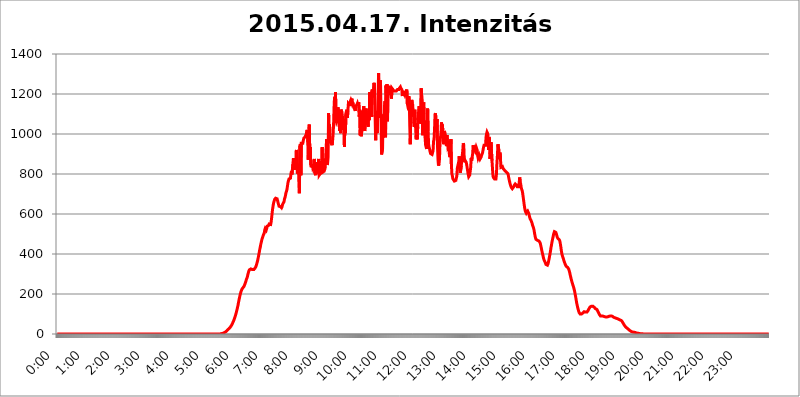
| Category | 2015.04.17. Intenzitás [W/m^2] |
|---|---|
| 0.0 | -0.256 |
| 0.0006944444444444445 | -0.256 |
| 0.001388888888888889 | -0.256 |
| 0.0020833333333333333 | -0.256 |
| 0.002777777777777778 | -0.256 |
| 0.003472222222222222 | -0.256 |
| 0.004166666666666667 | -0.256 |
| 0.004861111111111111 | -0.256 |
| 0.005555555555555556 | -0.256 |
| 0.0062499999999999995 | -0.256 |
| 0.006944444444444444 | -0.256 |
| 0.007638888888888889 | -0.256 |
| 0.008333333333333333 | -0.256 |
| 0.009027777777777779 | -0.256 |
| 0.009722222222222222 | -0.256 |
| 0.010416666666666666 | -0.256 |
| 0.011111111111111112 | -0.256 |
| 0.011805555555555555 | -0.256 |
| 0.012499999999999999 | -0.256 |
| 0.013194444444444444 | -0.256 |
| 0.013888888888888888 | -0.256 |
| 0.014583333333333332 | -0.256 |
| 0.015277777777777777 | -0.256 |
| 0.015972222222222224 | -0.256 |
| 0.016666666666666666 | -0.256 |
| 0.017361111111111112 | -0.256 |
| 0.018055555555555557 | -0.256 |
| 0.01875 | -0.256 |
| 0.019444444444444445 | -0.256 |
| 0.02013888888888889 | -0.256 |
| 0.020833333333333332 | -0.256 |
| 0.02152777777777778 | -0.256 |
| 0.022222222222222223 | -0.256 |
| 0.02291666666666667 | -0.256 |
| 0.02361111111111111 | -0.256 |
| 0.024305555555555556 | -0.256 |
| 0.024999999999999998 | -0.256 |
| 0.025694444444444447 | -0.256 |
| 0.02638888888888889 | -0.256 |
| 0.027083333333333334 | -0.256 |
| 0.027777777777777776 | -0.256 |
| 0.02847222222222222 | -0.256 |
| 0.029166666666666664 | -0.256 |
| 0.029861111111111113 | -0.256 |
| 0.030555555555555555 | -0.256 |
| 0.03125 | -0.256 |
| 0.03194444444444445 | -0.256 |
| 0.03263888888888889 | -0.256 |
| 0.03333333333333333 | -0.256 |
| 0.034027777777777775 | -0.256 |
| 0.034722222222222224 | -0.256 |
| 0.035416666666666666 | -0.256 |
| 0.036111111111111115 | -0.256 |
| 0.03680555555555556 | -0.256 |
| 0.0375 | -0.256 |
| 0.03819444444444444 | -0.256 |
| 0.03888888888888889 | -0.256 |
| 0.03958333333333333 | -0.256 |
| 0.04027777777777778 | -0.256 |
| 0.04097222222222222 | -0.256 |
| 0.041666666666666664 | -0.256 |
| 0.042361111111111106 | -0.256 |
| 0.04305555555555556 | -0.256 |
| 0.043750000000000004 | -0.256 |
| 0.044444444444444446 | -0.256 |
| 0.04513888888888889 | -0.256 |
| 0.04583333333333334 | -0.256 |
| 0.04652777777777778 | -0.256 |
| 0.04722222222222222 | -0.256 |
| 0.04791666666666666 | -0.256 |
| 0.04861111111111111 | -0.256 |
| 0.049305555555555554 | -0.256 |
| 0.049999999999999996 | -0.256 |
| 0.05069444444444445 | -0.256 |
| 0.051388888888888894 | -0.256 |
| 0.052083333333333336 | -0.256 |
| 0.05277777777777778 | -0.256 |
| 0.05347222222222222 | -0.256 |
| 0.05416666666666667 | -0.256 |
| 0.05486111111111111 | -0.256 |
| 0.05555555555555555 | -0.256 |
| 0.05625 | -0.256 |
| 0.05694444444444444 | -0.256 |
| 0.057638888888888885 | -0.256 |
| 0.05833333333333333 | -0.256 |
| 0.05902777777777778 | -0.256 |
| 0.059722222222222225 | -0.256 |
| 0.06041666666666667 | -0.256 |
| 0.061111111111111116 | -0.256 |
| 0.06180555555555556 | -0.256 |
| 0.0625 | -0.256 |
| 0.06319444444444444 | -0.256 |
| 0.06388888888888888 | -0.256 |
| 0.06458333333333334 | -0.256 |
| 0.06527777777777778 | -0.256 |
| 0.06597222222222222 | -0.256 |
| 0.06666666666666667 | -0.256 |
| 0.06736111111111111 | -0.256 |
| 0.06805555555555555 | -0.256 |
| 0.06874999999999999 | -0.256 |
| 0.06944444444444443 | -0.256 |
| 0.07013888888888889 | -0.256 |
| 0.07083333333333333 | -0.256 |
| 0.07152777777777779 | -0.256 |
| 0.07222222222222223 | -0.256 |
| 0.07291666666666667 | -0.256 |
| 0.07361111111111111 | -0.256 |
| 0.07430555555555556 | -0.256 |
| 0.075 | -0.256 |
| 0.07569444444444444 | -0.256 |
| 0.0763888888888889 | -0.256 |
| 0.07708333333333334 | -0.256 |
| 0.07777777777777778 | -0.256 |
| 0.07847222222222222 | -0.256 |
| 0.07916666666666666 | -0.256 |
| 0.0798611111111111 | -0.256 |
| 0.08055555555555556 | -0.256 |
| 0.08125 | -0.256 |
| 0.08194444444444444 | -0.256 |
| 0.08263888888888889 | -0.256 |
| 0.08333333333333333 | -0.256 |
| 0.08402777777777777 | -0.256 |
| 0.08472222222222221 | -0.256 |
| 0.08541666666666665 | -0.256 |
| 0.08611111111111112 | -0.256 |
| 0.08680555555555557 | -0.256 |
| 0.08750000000000001 | -0.256 |
| 0.08819444444444445 | -0.256 |
| 0.08888888888888889 | -0.256 |
| 0.08958333333333333 | -0.256 |
| 0.09027777777777778 | -0.256 |
| 0.09097222222222222 | -0.256 |
| 0.09166666666666667 | -0.256 |
| 0.09236111111111112 | -0.256 |
| 0.09305555555555556 | -0.256 |
| 0.09375 | -0.256 |
| 0.09444444444444444 | -0.256 |
| 0.09513888888888888 | -0.256 |
| 0.09583333333333333 | -0.256 |
| 0.09652777777777777 | -0.256 |
| 0.09722222222222222 | -0.256 |
| 0.09791666666666667 | -0.256 |
| 0.09861111111111111 | -0.256 |
| 0.09930555555555555 | -0.256 |
| 0.09999999999999999 | -0.256 |
| 0.10069444444444443 | -0.256 |
| 0.1013888888888889 | -0.256 |
| 0.10208333333333335 | -0.256 |
| 0.10277777777777779 | -0.256 |
| 0.10347222222222223 | -0.256 |
| 0.10416666666666667 | -0.256 |
| 0.10486111111111111 | -0.256 |
| 0.10555555555555556 | -0.256 |
| 0.10625 | -0.256 |
| 0.10694444444444444 | -0.256 |
| 0.1076388888888889 | -0.256 |
| 0.10833333333333334 | -0.256 |
| 0.10902777777777778 | -0.256 |
| 0.10972222222222222 | -0.256 |
| 0.1111111111111111 | -0.256 |
| 0.11180555555555556 | -0.256 |
| 0.11180555555555556 | -0.256 |
| 0.1125 | -0.256 |
| 0.11319444444444444 | -0.256 |
| 0.11388888888888889 | -0.256 |
| 0.11458333333333333 | -0.256 |
| 0.11527777777777777 | -0.256 |
| 0.11597222222222221 | -0.256 |
| 0.11666666666666665 | -0.256 |
| 0.1173611111111111 | -0.256 |
| 0.11805555555555557 | -0.256 |
| 0.11944444444444445 | -0.256 |
| 0.12013888888888889 | -0.256 |
| 0.12083333333333333 | -0.256 |
| 0.12152777777777778 | -0.256 |
| 0.12222222222222223 | -0.256 |
| 0.12291666666666667 | -0.256 |
| 0.12291666666666667 | -0.256 |
| 0.12361111111111112 | -0.256 |
| 0.12430555555555556 | -0.256 |
| 0.125 | -0.256 |
| 0.12569444444444444 | -0.256 |
| 0.12638888888888888 | -0.256 |
| 0.12708333333333333 | -0.256 |
| 0.16875 | -0.256 |
| 0.12847222222222224 | -0.256 |
| 0.12916666666666668 | -0.256 |
| 0.12986111111111112 | -0.256 |
| 0.13055555555555556 | -0.256 |
| 0.13125 | -0.256 |
| 0.13194444444444445 | -0.256 |
| 0.1326388888888889 | -0.256 |
| 0.13333333333333333 | -0.256 |
| 0.13402777777777777 | -0.256 |
| 0.13402777777777777 | -0.256 |
| 0.13472222222222222 | -0.256 |
| 0.13541666666666666 | -0.256 |
| 0.1361111111111111 | -0.256 |
| 0.13749999999999998 | -0.256 |
| 0.13819444444444443 | -0.256 |
| 0.1388888888888889 | -0.256 |
| 0.13958333333333334 | -0.256 |
| 0.14027777777777778 | -0.256 |
| 0.14097222222222222 | -0.256 |
| 0.14166666666666666 | -0.256 |
| 0.1423611111111111 | -0.256 |
| 0.14305555555555557 | -0.256 |
| 0.14375000000000002 | -0.256 |
| 0.14444444444444446 | -0.256 |
| 0.1451388888888889 | -0.256 |
| 0.1451388888888889 | -0.256 |
| 0.14652777777777778 | -0.256 |
| 0.14722222222222223 | -0.256 |
| 0.14791666666666667 | -0.256 |
| 0.1486111111111111 | -0.256 |
| 0.14930555555555555 | -0.256 |
| 0.15 | -0.256 |
| 0.15069444444444444 | -0.256 |
| 0.15138888888888888 | -0.256 |
| 0.15208333333333332 | -0.256 |
| 0.15277777777777776 | -0.256 |
| 0.15347222222222223 | -0.256 |
| 0.15416666666666667 | -0.256 |
| 0.15486111111111112 | -0.256 |
| 0.15555555555555556 | -0.256 |
| 0.15625 | -0.256 |
| 0.15694444444444444 | -0.256 |
| 0.15763888888888888 | -0.256 |
| 0.15833333333333333 | -0.256 |
| 0.15902777777777777 | -0.256 |
| 0.15972222222222224 | -0.256 |
| 0.16041666666666668 | -0.256 |
| 0.16111111111111112 | -0.256 |
| 0.16180555555555556 | -0.256 |
| 0.1625 | -0.256 |
| 0.16319444444444445 | -0.256 |
| 0.1638888888888889 | -0.256 |
| 0.16458333333333333 | -0.256 |
| 0.16527777777777777 | -0.256 |
| 0.16597222222222222 | -0.256 |
| 0.16666666666666666 | -0.256 |
| 0.1673611111111111 | -0.256 |
| 0.16805555555555554 | -0.256 |
| 0.16874999999999998 | -0.256 |
| 0.16944444444444443 | -0.256 |
| 0.17013888888888887 | -0.256 |
| 0.1708333333333333 | -0.256 |
| 0.17152777777777775 | -0.256 |
| 0.17222222222222225 | -0.256 |
| 0.1729166666666667 | -0.256 |
| 0.17361111111111113 | -0.256 |
| 0.17430555555555557 | -0.256 |
| 0.17500000000000002 | -0.256 |
| 0.17569444444444446 | -0.256 |
| 0.1763888888888889 | -0.256 |
| 0.17708333333333334 | -0.256 |
| 0.17777777777777778 | -0.256 |
| 0.17847222222222223 | -0.256 |
| 0.17916666666666667 | -0.256 |
| 0.1798611111111111 | -0.256 |
| 0.18055555555555555 | -0.256 |
| 0.18125 | -0.256 |
| 0.18194444444444444 | -0.256 |
| 0.1826388888888889 | -0.256 |
| 0.18333333333333335 | -0.256 |
| 0.1840277777777778 | -0.256 |
| 0.18472222222222223 | -0.256 |
| 0.18541666666666667 | -0.256 |
| 0.18611111111111112 | -0.256 |
| 0.18680555555555556 | -0.256 |
| 0.1875 | -0.256 |
| 0.18819444444444444 | -0.256 |
| 0.18888888888888888 | -0.256 |
| 0.18958333333333333 | -0.256 |
| 0.19027777777777777 | -0.256 |
| 0.1909722222222222 | -0.256 |
| 0.19166666666666665 | -0.256 |
| 0.19236111111111112 | -0.256 |
| 0.19305555555555554 | -0.256 |
| 0.19375 | -0.256 |
| 0.19444444444444445 | -0.256 |
| 0.1951388888888889 | -0.256 |
| 0.19583333333333333 | -0.256 |
| 0.19652777777777777 | -0.256 |
| 0.19722222222222222 | -0.256 |
| 0.19791666666666666 | -0.256 |
| 0.1986111111111111 | -0.256 |
| 0.19930555555555554 | -0.256 |
| 0.19999999999999998 | -0.256 |
| 0.20069444444444443 | -0.256 |
| 0.20138888888888887 | -0.256 |
| 0.2020833333333333 | -0.256 |
| 0.2027777777777778 | -0.256 |
| 0.2034722222222222 | -0.256 |
| 0.2041666666666667 | -0.256 |
| 0.20486111111111113 | -0.256 |
| 0.20555555555555557 | -0.256 |
| 0.20625000000000002 | -0.256 |
| 0.20694444444444446 | -0.256 |
| 0.2076388888888889 | -0.256 |
| 0.20833333333333334 | -0.256 |
| 0.20902777777777778 | -0.256 |
| 0.20972222222222223 | -0.256 |
| 0.21041666666666667 | -0.256 |
| 0.2111111111111111 | -0.256 |
| 0.21180555555555555 | -0.256 |
| 0.2125 | -0.256 |
| 0.21319444444444444 | -0.256 |
| 0.2138888888888889 | -0.256 |
| 0.21458333333333335 | -0.256 |
| 0.2152777777777778 | -0.256 |
| 0.21597222222222223 | -0.256 |
| 0.21666666666666667 | -0.256 |
| 0.21736111111111112 | -0.256 |
| 0.21805555555555556 | -0.256 |
| 0.21875 | -0.256 |
| 0.21944444444444444 | -0.256 |
| 0.22013888888888888 | -0.256 |
| 0.22083333333333333 | -0.256 |
| 0.22152777777777777 | -0.256 |
| 0.2222222222222222 | -0.256 |
| 0.22291666666666665 | -0.256 |
| 0.2236111111111111 | -0.256 |
| 0.22430555555555556 | -0.256 |
| 0.225 | -0.256 |
| 0.22569444444444445 | -0.256 |
| 0.2263888888888889 | -0.256 |
| 0.22708333333333333 | -0.256 |
| 0.22777777777777777 | -0.256 |
| 0.22847222222222222 | 1.09 |
| 0.22916666666666666 | 1.09 |
| 0.2298611111111111 | 1.09 |
| 0.23055555555555554 | 2.439 |
| 0.23124999999999998 | 2.439 |
| 0.23194444444444443 | 3.791 |
| 0.23263888888888887 | 3.791 |
| 0.2333333333333333 | 5.146 |
| 0.2340277777777778 | 6.503 |
| 0.2347222222222222 | 7.862 |
| 0.2354166666666667 | 9.225 |
| 0.23611111111111113 | 10.589 |
| 0.23680555555555557 | 13.325 |
| 0.23750000000000002 | 14.696 |
| 0.23819444444444446 | 17.444 |
| 0.2388888888888889 | 20.201 |
| 0.23958333333333334 | 21.582 |
| 0.24027777777777778 | 24.35 |
| 0.24097222222222223 | 27.124 |
| 0.24166666666666667 | 29.905 |
| 0.2423611111111111 | 32.691 |
| 0.24305555555555555 | 36.881 |
| 0.24375 | 39.68 |
| 0.24444444444444446 | 43.886 |
| 0.24513888888888888 | 48.1 |
| 0.24583333333333335 | 53.73 |
| 0.2465277777777778 | 59.368 |
| 0.24722222222222223 | 65.012 |
| 0.24791666666666667 | 70.658 |
| 0.24861111111111112 | 77.715 |
| 0.24930555555555556 | 86.175 |
| 0.25 | 93.212 |
| 0.25069444444444444 | 101.634 |
| 0.2513888888888889 | 111.42 |
| 0.2520833333333333 | 121.152 |
| 0.25277777777777777 | 132.196 |
| 0.2534722222222222 | 143.144 |
| 0.25416666666666665 | 156.678 |
| 0.2548611111111111 | 168.703 |
| 0.2555555555555556 | 180.569 |
| 0.25625000000000003 | 192.271 |
| 0.2569444444444445 | 202.534 |
| 0.2576388888888889 | 211.405 |
| 0.25833333333333336 | 217.681 |
| 0.2590277777777778 | 223.906 |
| 0.25972222222222224 | 227.618 |
| 0.2604166666666667 | 231.313 |
| 0.2611111111111111 | 233.766 |
| 0.26180555555555557 | 237.433 |
| 0.2625 | 242.296 |
| 0.26319444444444445 | 249.538 |
| 0.2638888888888889 | 256.722 |
| 0.26458333333333334 | 263.851 |
| 0.2652777777777778 | 273.281 |
| 0.2659722222222222 | 279.136 |
| 0.26666666666666666 | 286.13 |
| 0.2673611111111111 | 297.728 |
| 0.26805555555555555 | 306.974 |
| 0.26875 | 315.059 |
| 0.26944444444444443 | 320.84 |
| 0.2701388888888889 | 324.314 |
| 0.2708333333333333 | 325.473 |
| 0.27152777777777776 | 325.473 |
| 0.2722222222222222 | 324.314 |
| 0.27291666666666664 | 323.156 |
| 0.2736111111111111 | 321.998 |
| 0.2743055555555555 | 320.84 |
| 0.27499999999999997 | 320.84 |
| 0.27569444444444446 | 321.998 |
| 0.27638888888888885 | 324.314 |
| 0.27708333333333335 | 327.793 |
| 0.2777777777777778 | 331.279 |
| 0.27847222222222223 | 335.941 |
| 0.2791666666666667 | 342.968 |
| 0.2798611111111111 | 351.235 |
| 0.28055555555555556 | 360.798 |
| 0.28125 | 370.515 |
| 0.28194444444444444 | 382.93 |
| 0.2826388888888889 | 395.711 |
| 0.2833333333333333 | 408.934 |
| 0.28402777777777777 | 422.678 |
| 0.2847222222222222 | 434.107 |
| 0.28541666666666665 | 447.487 |
| 0.28611111111111115 | 458.318 |
| 0.28680555555555554 | 469.557 |
| 0.28750000000000003 | 477.854 |
| 0.2881944444444445 | 484.662 |
| 0.2888888888888889 | 493.398 |
| 0.28958333333333336 | 498.764 |
| 0.2902777777777778 | 504.229 |
| 0.29097222222222224 | 519.3 |
| 0.2916666666666667 | 527.122 |
| 0.2923611111111111 | 531.108 |
| 0.29305555555555557 | 519.3 |
| 0.29375 | 527.122 |
| 0.29444444444444445 | 539.234 |
| 0.2951388888888889 | 539.234 |
| 0.29583333333333334 | 539.234 |
| 0.2965277777777778 | 543.376 |
| 0.2972222222222222 | 549.691 |
| 0.29791666666666666 | 551.823 |
| 0.2986111111111111 | 551.823 |
| 0.29930555555555555 | 547.572 |
| 0.3 | 560.495 |
| 0.30069444444444443 | 580.866 |
| 0.3013888888888889 | 604.992 |
| 0.3020833333333333 | 625.508 |
| 0.30277777777777776 | 641.649 |
| 0.3034722222222222 | 655.618 |
| 0.30416666666666664 | 664.234 |
| 0.3048611111111111 | 673.03 |
| 0.3055555555555555 | 676.003 |
| 0.30624999999999997 | 678.997 |
| 0.3069444444444444 | 678.997 |
| 0.3076388888888889 | 678.997 |
| 0.30833333333333335 | 676.003 |
| 0.3090277777777778 | 667.146 |
| 0.30972222222222223 | 655.618 |
| 0.3104166666666667 | 647.179 |
| 0.3111111111111111 | 638.912 |
| 0.31180555555555556 | 638.912 |
| 0.3125 | 636.194 |
| 0.31319444444444444 | 636.194 |
| 0.3138888888888889 | 633.495 |
| 0.3145833333333333 | 630.814 |
| 0.31527777777777777 | 636.194 |
| 0.3159722222222222 | 647.179 |
| 0.31666666666666665 | 652.786 |
| 0.31736111111111115 | 655.618 |
| 0.31805555555555554 | 661.343 |
| 0.31875000000000003 | 676.003 |
| 0.3194444444444445 | 682.011 |
| 0.3201388888888889 | 694.278 |
| 0.32083333333333336 | 706.89 |
| 0.3215277777777778 | 713.328 |
| 0.32222222222222224 | 723.153 |
| 0.3229166666666667 | 739.988 |
| 0.3236111111111111 | 757.414 |
| 0.32430555555555557 | 760.972 |
| 0.325 | 775.451 |
| 0.32569444444444445 | 779.134 |
| 0.3263888888888889 | 771.794 |
| 0.32708333333333334 | 779.134 |
| 0.3277777777777778 | 801.768 |
| 0.3284722222222222 | 813.439 |
| 0.32916666666666666 | 797.931 |
| 0.3298611111111111 | 801.768 |
| 0.33055555555555555 | 849.92 |
| 0.33125 | 879.878 |
| 0.33194444444444443 | 875.511 |
| 0.3326388888888889 | 821.353 |
| 0.3333333333333333 | 845.755 |
| 0.3340277777777778 | 858.335 |
| 0.3347222222222222 | 837.51 |
| 0.3354166666666667 | 920.533 |
| 0.3361111111111111 | 849.92 |
| 0.3368055555555556 | 801.768 |
| 0.33749999999999997 | 849.92 |
| 0.33819444444444446 | 833.43 |
| 0.33888888888888885 | 760.972 |
| 0.33958333333333335 | 703.704 |
| 0.34027777777777773 | 939.404 |
| 0.34097222222222223 | 949.03 |
| 0.3416666666666666 | 794.119 |
| 0.3423611111111111 | 953.892 |
| 0.3430555555555555 | 958.785 |
| 0.34375 | 958.785 |
| 0.3444444444444445 | 953.892 |
| 0.3451388888888889 | 968.671 |
| 0.3458333333333334 | 978.688 |
| 0.34652777777777777 | 978.688 |
| 0.34722222222222227 | 983.747 |
| 0.34791666666666665 | 988.839 |
| 0.34861111111111115 | 993.965 |
| 0.34930555555555554 | 999.125 |
| 0.35000000000000003 | 1014.809 |
| 0.3506944444444444 | 1020.106 |
| 0.3513888888888889 | 958.785 |
| 0.3520833333333333 | 871.173 |
| 0.3527777777777778 | 1004.318 |
| 0.3534722222222222 | 1047.117 |
| 0.3541666666666667 | 915.893 |
| 0.3548611111111111 | 934.639 |
| 0.35555555555555557 | 845.755 |
| 0.35625 | 833.43 |
| 0.35694444444444445 | 837.51 |
| 0.3576388888888889 | 849.92 |
| 0.35833333333333334 | 833.43 |
| 0.3590277777777778 | 837.51 |
| 0.3597222222222222 | 845.755 |
| 0.36041666666666666 | 875.511 |
| 0.3611111111111111 | 805.632 |
| 0.36180555555555555 | 805.632 |
| 0.3625 | 794.119 |
| 0.36319444444444443 | 858.335 |
| 0.3638888888888889 | 801.768 |
| 0.3645833333333333 | 817.382 |
| 0.3652777777777778 | 854.113 |
| 0.3659722222222222 | 813.439 |
| 0.3666666666666667 | 875.511 |
| 0.3673611111111111 | 794.119 |
| 0.3680555555555556 | 797.931 |
| 0.36874999999999997 | 801.768 |
| 0.36944444444444446 | 797.931 |
| 0.37013888888888885 | 797.931 |
| 0.37083333333333335 | 805.632 |
| 0.37152777777777773 | 934.639 |
| 0.37222222222222223 | 809.522 |
| 0.3729166666666666 | 809.522 |
| 0.3736111111111111 | 809.522 |
| 0.3743055555555555 | 813.439 |
| 0.375 | 817.382 |
| 0.3756944444444445 | 829.377 |
| 0.3763888888888889 | 833.43 |
| 0.3770833333333334 | 833.43 |
| 0.37777777777777777 | 973.663 |
| 0.37847222222222227 | 845.755 |
| 0.37916666666666665 | 854.113 |
| 0.37986111111111115 | 884.274 |
| 0.38055555555555554 | 1103.843 |
| 0.38125000000000003 | 1004.318 |
| 0.3819444444444444 | 1047.117 |
| 0.3826388888888889 | 953.892 |
| 0.3833333333333333 | 968.671 |
| 0.3840277777777778 | 963.712 |
| 0.3847222222222222 | 963.712 |
| 0.3854166666666667 | 944.201 |
| 0.3861111111111111 | 963.712 |
| 0.38680555555555557 | 993.965 |
| 0.3875 | 1041.644 |
| 0.38819444444444445 | 1127.578 |
| 0.3888888888888889 | 1183.249 |
| 0.38958333333333334 | 1139.675 |
| 0.3902777777777778 | 1209.029 |
| 0.3909722222222222 | 1069.368 |
| 0.39166666666666666 | 1058.17 |
| 0.3923611111111111 | 1063.751 |
| 0.39305555555555555 | 1098.004 |
| 0.39375 | 1133.607 |
| 0.39444444444444443 | 1098.004 |
| 0.3951388888888889 | 1121.587 |
| 0.3958333333333333 | 1014.809 |
| 0.3965277777777778 | 1092.203 |
| 0.3972222222222222 | 1004.318 |
| 0.3979166666666667 | 1121.587 |
| 0.3986111111111111 | 1115.634 |
| 0.3993055555555556 | 1109.72 |
| 0.39999999999999997 | 1086.439 |
| 0.40069444444444446 | 1020.106 |
| 0.40138888888888885 | 1020.106 |
| 0.40208333333333335 | 1041.644 |
| 0.40277777777777773 | 934.639 |
| 0.40347222222222223 | 1075.021 |
| 0.4041666666666666 | 1004.318 |
| 0.4048611111111111 | 1103.843 |
| 0.4055555555555555 | 1103.843 |
| 0.40625 | 1121.587 |
| 0.4069444444444445 | 1080.711 |
| 0.4076388888888889 | 1115.634 |
| 0.4083333333333334 | 1151.928 |
| 0.40902777777777777 | 1151.928 |
| 0.40972222222222227 | 1145.782 |
| 0.41041666666666665 | 1139.675 |
| 0.41111111111111115 | 1164.337 |
| 0.41180555555555554 | 1170.601 |
| 0.41250000000000003 | 1164.337 |
| 0.4131944444444444 | 1176.905 |
| 0.4138888888888889 | 1151.928 |
| 0.4145833333333333 | 1158.113 |
| 0.4152777777777778 | 1133.607 |
| 0.4159722222222222 | 1145.782 |
| 0.4166666666666667 | 1127.578 |
| 0.4173611111111111 | 1121.587 |
| 0.41805555555555557 | 1115.634 |
| 0.41875 | 1139.675 |
| 0.41944444444444445 | 1139.675 |
| 0.4201388888888889 | 1145.782 |
| 0.42083333333333334 | 1151.928 |
| 0.4215277777777778 | 1139.675 |
| 0.4222222222222222 | 1139.675 |
| 0.42291666666666666 | 1158.113 |
| 0.4236111111111111 | 1086.439 |
| 0.42430555555555555 | 1121.587 |
| 0.425 | 993.965 |
| 0.42569444444444443 | 1115.634 |
| 0.4263888888888889 | 988.839 |
| 0.4270833333333333 | 1014.809 |
| 0.4277777777777778 | 1063.751 |
| 0.4284722222222222 | 1036.206 |
| 0.4291666666666667 | 1069.368 |
| 0.4298611111111111 | 1139.675 |
| 0.4305555555555556 | 1052.625 |
| 0.43124999999999997 | 1014.809 |
| 0.43194444444444446 | 1052.625 |
| 0.43263888888888885 | 1115.634 |
| 0.43333333333333335 | 1127.578 |
| 0.43402777777777773 | 1063.751 |
| 0.43472222222222223 | 1058.17 |
| 0.4354166666666666 | 1047.117 |
| 0.4361111111111111 | 1036.206 |
| 0.4368055555555555 | 1115.634 |
| 0.4375 | 1069.368 |
| 0.4381944444444445 | 1209.029 |
| 0.4388888888888889 | 1209.029 |
| 0.4395833333333334 | 1086.439 |
| 0.44027777777777777 | 1209.029 |
| 0.44097222222222227 | 1086.439 |
| 0.44166666666666665 | 1222.164 |
| 0.44236111111111115 | 1196.058 |
| 0.44305555555555554 | 1183.249 |
| 0.44375000000000003 | 1183.249 |
| 0.4444444444444444 | 1255.731 |
| 0.4451388888888889 | 1215.576 |
| 0.4458333333333333 | 1086.439 |
| 0.4465277777777778 | 968.671 |
| 0.4472222222222222 | 1052.625 |
| 0.4479166666666667 | 1115.634 |
| 0.4486111111111111 | 1004.318 |
| 0.44930555555555557 | 1069.368 |
| 0.45 | 1069.368 |
| 0.45069444444444445 | 1304.515 |
| 0.4513888888888889 | 1145.782 |
| 0.45208333333333334 | 1080.711 |
| 0.4527777777777778 | 1269.454 |
| 0.4534722222222222 | 1242.179 |
| 0.45416666666666666 | 1242.179 |
| 0.4548611111111111 | 897.643 |
| 0.45555555555555555 | 897.643 |
| 0.45625 | 925.203 |
| 0.45694444444444443 | 1098.004 |
| 0.4576388888888889 | 983.747 |
| 0.4583333333333333 | 1025.437 |
| 0.4590277777777778 | 1139.675 |
| 0.4597222222222222 | 1164.337 |
| 0.4604166666666667 | 983.747 |
| 0.4611111111111111 | 1242.179 |
| 0.4618055555555556 | 1189.633 |
| 0.46249999999999997 | 1248.934 |
| 0.46319444444444446 | 1063.751 |
| 0.46388888888888885 | 1235.465 |
| 0.46458333333333335 | 1235.465 |
| 0.46527777777777773 | 1235.465 |
| 0.46597222222222223 | 1235.465 |
| 0.4666666666666666 | 1235.465 |
| 0.4673611111111111 | 1222.164 |
| 0.4680555555555555 | 1202.523 |
| 0.46875 | 1176.905 |
| 0.4694444444444445 | 1228.794 |
| 0.4701388888888889 | 1228.794 |
| 0.4708333333333334 | 1222.164 |
| 0.47152777777777777 | 1215.576 |
| 0.47222222222222227 | 1215.576 |
| 0.47291666666666665 | 1215.576 |
| 0.47361111111111115 | 1215.576 |
| 0.47430555555555554 | 1215.576 |
| 0.47500000000000003 | 1215.576 |
| 0.4756944444444444 | 1215.576 |
| 0.4763888888888889 | 1215.576 |
| 0.4770833333333333 | 1222.164 |
| 0.4777777777777778 | 1222.164 |
| 0.4784722222222222 | 1222.164 |
| 0.4791666666666667 | 1222.164 |
| 0.4798611111111111 | 1228.794 |
| 0.48055555555555557 | 1228.794 |
| 0.48125 | 1235.465 |
| 0.48194444444444445 | 1228.794 |
| 0.4826388888888889 | 1228.794 |
| 0.48333333333333334 | 1222.164 |
| 0.4840277777777778 | 1189.633 |
| 0.4847222222222222 | 1215.576 |
| 0.48541666666666666 | 1209.029 |
| 0.4861111111111111 | 1209.029 |
| 0.48680555555555555 | 1202.523 |
| 0.4875 | 1196.058 |
| 0.48819444444444443 | 1196.058 |
| 0.4888888888888889 | 1209.029 |
| 0.4895833333333333 | 1209.029 |
| 0.4902777777777778 | 1222.164 |
| 0.4909722222222222 | 1151.928 |
| 0.4916666666666667 | 1139.675 |
| 0.4923611111111111 | 1145.782 |
| 0.4930555555555556 | 1189.633 |
| 0.49374999999999997 | 1164.337 |
| 0.49444444444444446 | 1036.206 |
| 0.49513888888888885 | 949.03 |
| 0.49583333333333335 | 1098.004 |
| 0.49652777777777773 | 1115.634 |
| 0.49722222222222223 | 1170.601 |
| 0.4979166666666666 | 1151.928 |
| 0.4986111111111111 | 1145.782 |
| 0.4993055555555555 | 1086.439 |
| 0.5 | 1109.72 |
| 0.5006944444444444 | 1036.206 |
| 0.5013888888888889 | 1121.587 |
| 0.5020833333333333 | 1069.368 |
| 0.5027777777777778 | 1069.368 |
| 0.5034722222222222 | 973.663 |
| 0.5041666666666667 | 1030.804 |
| 0.5048611111111111 | 973.663 |
| 0.5055555555555555 | 1036.206 |
| 0.50625 | 1080.711 |
| 0.5069444444444444 | 1115.634 |
| 0.5076388888888889 | 1139.675 |
| 0.5083333333333333 | 1052.625 |
| 0.5090277777777777 | 1058.17 |
| 0.5097222222222222 | 1058.17 |
| 0.5104166666666666 | 1228.794 |
| 0.5111111111111112 | 1228.794 |
| 0.5118055555555555 | 1151.928 |
| 0.5125000000000001 | 993.965 |
| 0.5131944444444444 | 1058.17 |
| 0.513888888888889 | 1158.113 |
| 0.5145833333333333 | 1103.843 |
| 0.5152777777777778 | 1030.804 |
| 0.5159722222222222 | 978.688 |
| 0.5166666666666667 | 944.201 |
| 0.517361111111111 | 934.639 |
| 0.5180555555555556 | 925.203 |
| 0.5187499999999999 | 963.712 |
| 0.5194444444444445 | 1127.578 |
| 0.5201388888888888 | 1014.809 |
| 0.5208333333333334 | 949.03 |
| 0.5215277777777778 | 934.639 |
| 0.5222222222222223 | 925.203 |
| 0.5229166666666667 | 911.285 |
| 0.5236111111111111 | 902.16 |
| 0.5243055555555556 | 902.16 |
| 0.525 | 897.643 |
| 0.5256944444444445 | 897.643 |
| 0.5263888888888889 | 902.16 |
| 0.5270833333333333 | 915.893 |
| 0.5277777777777778 | 963.712 |
| 0.5284722222222222 | 973.663 |
| 0.5291666666666667 | 1025.437 |
| 0.5298611111111111 | 1098.004 |
| 0.5305555555555556 | 1103.843 |
| 0.53125 | 1047.117 |
| 0.5319444444444444 | 1025.437 |
| 0.5326388888888889 | 1075.021 |
| 0.5333333333333333 | 934.639 |
| 0.5340277777777778 | 871.173 |
| 0.5347222222222222 | 841.619 |
| 0.5354166666666667 | 849.92 |
| 0.5361111111111111 | 875.511 |
| 0.5368055555555555 | 953.892 |
| 0.5375 | 983.747 |
| 0.5381944444444444 | 999.125 |
| 0.5388888888888889 | 1058.17 |
| 0.5395833333333333 | 1036.206 |
| 0.5402777777777777 | 1047.117 |
| 0.5409722222222222 | 993.965 |
| 0.5416666666666666 | 949.03 |
| 0.5423611111111112 | 978.688 |
| 0.5430555555555555 | 1014.809 |
| 0.5437500000000001 | 1004.318 |
| 0.5444444444444444 | 993.965 |
| 0.545138888888889 | 958.785 |
| 0.5458333333333333 | 939.404 |
| 0.5465277777777778 | 993.965 |
| 0.5472222222222222 | 963.712 |
| 0.5479166666666667 | 934.639 |
| 0.548611111111111 | 929.905 |
| 0.5493055555555556 | 944.201 |
| 0.5499999999999999 | 897.643 |
| 0.5506944444444445 | 884.274 |
| 0.5513888888888888 | 884.274 |
| 0.5520833333333334 | 973.663 |
| 0.5527777777777778 | 849.92 |
| 0.5534722222222223 | 801.768 |
| 0.5541666666666667 | 790.334 |
| 0.5548611111111111 | 775.451 |
| 0.5555555555555556 | 771.794 |
| 0.55625 | 771.794 |
| 0.5569444444444445 | 764.555 |
| 0.5576388888888889 | 760.972 |
| 0.5583333333333333 | 760.972 |
| 0.5590277777777778 | 768.162 |
| 0.5597222222222222 | 771.794 |
| 0.5604166666666667 | 790.334 |
| 0.5611111111111111 | 829.377 |
| 0.5618055555555556 | 833.43 |
| 0.5625 | 829.377 |
| 0.5631944444444444 | 862.585 |
| 0.5638888888888889 | 888.701 |
| 0.5645833333333333 | 825.351 |
| 0.5652777777777778 | 805.632 |
| 0.5659722222222222 | 809.522 |
| 0.5666666666666667 | 841.619 |
| 0.5673611111111111 | 871.173 |
| 0.5680555555555555 | 893.157 |
| 0.56875 | 915.893 |
| 0.5694444444444444 | 953.892 |
| 0.5701388888888889 | 944.201 |
| 0.5708333333333333 | 875.511 |
| 0.5715277777777777 | 858.335 |
| 0.5722222222222222 | 866.865 |
| 0.5729166666666666 | 862.585 |
| 0.5736111111111112 | 858.335 |
| 0.5743055555555555 | 845.755 |
| 0.5750000000000001 | 829.377 |
| 0.5756944444444444 | 813.439 |
| 0.576388888888889 | 797.931 |
| 0.5770833333333333 | 786.575 |
| 0.5777777777777778 | 782.842 |
| 0.5784722222222222 | 794.119 |
| 0.5791666666666667 | 813.439 |
| 0.579861111111111 | 833.43 |
| 0.5805555555555556 | 879.878 |
| 0.5812499999999999 | 866.865 |
| 0.5819444444444445 | 884.274 |
| 0.5826388888888888 | 902.16 |
| 0.5833333333333334 | 944.201 |
| 0.5840277777777778 | 934.639 |
| 0.5847222222222223 | 934.639 |
| 0.5854166666666667 | 934.639 |
| 0.5861111111111111 | 915.893 |
| 0.5868055555555556 | 915.893 |
| 0.5875 | 934.639 |
| 0.5881944444444445 | 939.404 |
| 0.5888888888888889 | 920.533 |
| 0.5895833333333333 | 893.157 |
| 0.5902777777777778 | 879.878 |
| 0.5909722222222222 | 884.274 |
| 0.5916666666666667 | 893.157 |
| 0.5923611111111111 | 888.701 |
| 0.5930555555555556 | 875.511 |
| 0.59375 | 875.511 |
| 0.5944444444444444 | 884.274 |
| 0.5951388888888889 | 893.157 |
| 0.5958333333333333 | 893.157 |
| 0.5965277777777778 | 906.707 |
| 0.5972222222222222 | 920.533 |
| 0.5979166666666667 | 934.639 |
| 0.5986111111111111 | 944.201 |
| 0.5993055555555555 | 944.201 |
| 0.6 | 939.404 |
| 0.6006944444444444 | 944.201 |
| 0.6013888888888889 | 983.747 |
| 0.6020833333333333 | 999.125 |
| 0.6027777777777777 | 1009.546 |
| 0.6034722222222222 | 1004.318 |
| 0.6041666666666666 | 993.965 |
| 0.6048611111111112 | 920.533 |
| 0.6055555555555555 | 983.747 |
| 0.6062500000000001 | 978.688 |
| 0.6069444444444444 | 875.511 |
| 0.607638888888889 | 871.173 |
| 0.6083333333333333 | 958.785 |
| 0.6090277777777778 | 953.892 |
| 0.6097222222222222 | 866.865 |
| 0.6104166666666667 | 866.865 |
| 0.611111111111111 | 790.334 |
| 0.6118055555555556 | 782.842 |
| 0.6124999999999999 | 779.134 |
| 0.6131944444444445 | 775.451 |
| 0.6138888888888888 | 771.794 |
| 0.6145833333333334 | 779.134 |
| 0.6152777777777778 | 775.451 |
| 0.6159722222222223 | 797.931 |
| 0.6166666666666667 | 854.113 |
| 0.6173611111111111 | 893.157 |
| 0.6180555555555556 | 949.03 |
| 0.61875 | 953.892 |
| 0.6194444444444445 | 915.893 |
| 0.6201388888888889 | 875.511 |
| 0.6208333333333333 | 906.707 |
| 0.6215277777777778 | 888.701 |
| 0.6222222222222222 | 833.43 |
| 0.6229166666666667 | 829.377 |
| 0.6236111111111111 | 829.377 |
| 0.6243055555555556 | 837.51 |
| 0.625 | 833.43 |
| 0.6256944444444444 | 825.351 |
| 0.6263888888888889 | 825.351 |
| 0.6270833333333333 | 825.351 |
| 0.6277777777777778 | 817.382 |
| 0.6284722222222222 | 813.439 |
| 0.6291666666666667 | 817.382 |
| 0.6298611111111111 | 809.522 |
| 0.6305555555555555 | 805.632 |
| 0.63125 | 809.522 |
| 0.6319444444444444 | 801.768 |
| 0.6326388888888889 | 794.119 |
| 0.6333333333333333 | 779.134 |
| 0.6340277777777777 | 768.162 |
| 0.6347222222222222 | 757.414 |
| 0.6354166666666666 | 746.886 |
| 0.6361111111111112 | 739.988 |
| 0.6368055555555555 | 733.184 |
| 0.6375000000000001 | 729.817 |
| 0.6381944444444444 | 726.474 |
| 0.638888888888889 | 726.474 |
| 0.6395833333333333 | 729.817 |
| 0.6402777777777778 | 736.574 |
| 0.6409722222222222 | 743.425 |
| 0.6416666666666667 | 746.886 |
| 0.642361111111111 | 750.371 |
| 0.6430555555555556 | 746.886 |
| 0.6437499999999999 | 746.886 |
| 0.6444444444444445 | 743.425 |
| 0.6451388888888888 | 736.574 |
| 0.6458333333333334 | 736.574 |
| 0.6465277777777778 | 736.574 |
| 0.6472222222222223 | 736.574 |
| 0.6479166666666667 | 757.414 |
| 0.6486111111111111 | 782.842 |
| 0.6493055555555556 | 757.414 |
| 0.65 | 750.371 |
| 0.6506944444444445 | 733.184 |
| 0.6513888888888889 | 723.153 |
| 0.6520833333333333 | 716.58 |
| 0.6527777777777778 | 703.704 |
| 0.6534722222222222 | 685.046 |
| 0.6541666666666667 | 667.146 |
| 0.6548611111111111 | 647.179 |
| 0.6555555555555556 | 630.814 |
| 0.65625 | 617.682 |
| 0.6569444444444444 | 610.016 |
| 0.6576388888888889 | 604.992 |
| 0.6583333333333333 | 610.016 |
| 0.6590277777777778 | 612.554 |
| 0.6597222222222222 | 615.11 |
| 0.6604166666666667 | 612.554 |
| 0.6611111111111111 | 604.992 |
| 0.6618055555555555 | 595.145 |
| 0.6625 | 585.562 |
| 0.6631944444444444 | 576.233 |
| 0.6638888888888889 | 571.661 |
| 0.6645833333333333 | 567.15 |
| 0.6652777777777777 | 560.495 |
| 0.6659722222222222 | 553.97 |
| 0.6666666666666666 | 543.376 |
| 0.6673611111111111 | 537.182 |
| 0.6680555555555556 | 529.108 |
| 0.6687500000000001 | 519.3 |
| 0.6694444444444444 | 504.229 |
| 0.6701388888888888 | 489.873 |
| 0.6708333333333334 | 479.541 |
| 0.6715277777777778 | 472.848 |
| 0.6722222222222222 | 467.925 |
| 0.6729166666666666 | 467.925 |
| 0.6736111111111112 | 467.925 |
| 0.6743055555555556 | 467.925 |
| 0.6749999999999999 | 467.925 |
| 0.6756944444444444 | 464.688 |
| 0.6763888888888889 | 461.486 |
| 0.6770833333333334 | 456.747 |
| 0.6777777777777777 | 449.011 |
| 0.6784722222222223 | 437.031 |
| 0.6791666666666667 | 425.497 |
| 0.6798611111111111 | 412.998 |
| 0.6805555555555555 | 402.262 |
| 0.68125 | 391.834 |
| 0.6819444444444445 | 380.42 |
| 0.6826388888888889 | 371.742 |
| 0.6833333333333332 | 366.851 |
| 0.6840277777777778 | 360.798 |
| 0.6847222222222222 | 354.805 |
| 0.6854166666666667 | 347.682 |
| 0.686111111111111 | 344.144 |
| 0.6868055555555556 | 342.968 |
| 0.6875 | 344.144 |
| 0.6881944444444444 | 350.049 |
| 0.688888888888889 | 359.595 |
| 0.6895833333333333 | 371.742 |
| 0.6902777777777778 | 384.191 |
| 0.6909722222222222 | 398.318 |
| 0.6916666666666668 | 412.998 |
| 0.6923611111111111 | 428.341 |
| 0.6930555555555555 | 442.962 |
| 0.69375 | 456.747 |
| 0.6944444444444445 | 469.557 |
| 0.6951388888888889 | 481.238 |
| 0.6958333333333333 | 493.398 |
| 0.6965277777777777 | 504.229 |
| 0.6972222222222223 | 511.671 |
| 0.6979166666666666 | 515.462 |
| 0.6986111111111111 | 513.561 |
| 0.6993055555555556 | 507.927 |
| 0.7000000000000001 | 500.575 |
| 0.7006944444444444 | 491.63 |
| 0.7013888888888888 | 482.945 |
| 0.7020833333333334 | 477.854 |
| 0.7027777777777778 | 474.507 |
| 0.7034722222222222 | 474.507 |
| 0.7041666666666666 | 471.198 |
| 0.7048611111111112 | 464.688 |
| 0.7055555555555556 | 452.082 |
| 0.7062499999999999 | 437.031 |
| 0.7069444444444444 | 418.495 |
| 0.7076388888888889 | 402.262 |
| 0.7083333333333334 | 393.122 |
| 0.7090277777777777 | 385.455 |
| 0.7097222222222223 | 377.925 |
| 0.7104166666666667 | 369.291 |
| 0.7111111111111111 | 362.004 |
| 0.7118055555555555 | 354.805 |
| 0.7125 | 347.682 |
| 0.7131944444444445 | 342.968 |
| 0.7138888888888889 | 338.278 |
| 0.7145833333333332 | 335.941 |
| 0.7152777777777778 | 334.774 |
| 0.7159722222222222 | 332.443 |
| 0.7166666666666667 | 330.117 |
| 0.717361111111111 | 324.314 |
| 0.7180555555555556 | 316.215 |
| 0.71875 | 306.974 |
| 0.7194444444444444 | 295.413 |
| 0.720138888888889 | 284.967 |
| 0.7208333333333333 | 274.454 |
| 0.7215277777777778 | 265.034 |
| 0.7222222222222222 | 256.722 |
| 0.7229166666666668 | 248.335 |
| 0.7236111111111111 | 239.868 |
| 0.7243055555555555 | 232.54 |
| 0.725 | 222.665 |
| 0.7256944444444445 | 212.664 |
| 0.7263888888888889 | 198.701 |
| 0.7270833333333333 | 185.79 |
| 0.7277777777777777 | 171.353 |
| 0.7284722222222223 | 156.678 |
| 0.7291666666666666 | 144.506 |
| 0.7298611111111111 | 133.57 |
| 0.7305555555555556 | 123.922 |
| 0.7312500000000001 | 114.207 |
| 0.7319444444444444 | 107.232 |
| 0.7326388888888888 | 103.035 |
| 0.7333333333333334 | 100.233 |
| 0.7340277777777778 | 100.233 |
| 0.7347222222222222 | 98.83 |
| 0.7354166666666666 | 100.233 |
| 0.7361111111111112 | 100.233 |
| 0.7368055555555556 | 103.035 |
| 0.7374999999999999 | 105.834 |
| 0.7381944444444444 | 108.629 |
| 0.7388888888888889 | 111.42 |
| 0.7395833333333334 | 111.42 |
| 0.7402777777777777 | 111.42 |
| 0.7409722222222223 | 110.025 |
| 0.7416666666666667 | 110.025 |
| 0.7423611111111111 | 108.629 |
| 0.7430555555555555 | 110.025 |
| 0.74375 | 112.814 |
| 0.7444444444444445 | 116.989 |
| 0.7451388888888889 | 121.152 |
| 0.7458333333333332 | 126.685 |
| 0.7465277777777778 | 130.821 |
| 0.7472222222222222 | 134.943 |
| 0.7479166666666667 | 137.683 |
| 0.748611111111111 | 139.051 |
| 0.7493055555555556 | 139.051 |
| 0.75 | 139.051 |
| 0.7506944444444444 | 139.051 |
| 0.751388888888889 | 139.051 |
| 0.7520833333333333 | 139.051 |
| 0.7527777777777778 | 136.314 |
| 0.7534722222222222 | 132.196 |
| 0.7541666666666668 | 129.444 |
| 0.7548611111111111 | 126.685 |
| 0.7555555555555555 | 125.304 |
| 0.75625 | 123.922 |
| 0.7569444444444445 | 122.538 |
| 0.7576388888888889 | 118.378 |
| 0.7583333333333333 | 112.814 |
| 0.7590277777777777 | 107.232 |
| 0.7597222222222223 | 103.035 |
| 0.7604166666666666 | 97.427 |
| 0.7611111111111111 | 93.212 |
| 0.7618055555555556 | 90.399 |
| 0.7625000000000001 | 90.399 |
| 0.7631944444444444 | 90.399 |
| 0.7638888888888888 | 90.399 |
| 0.7645833333333334 | 90.399 |
| 0.7652777777777778 | 88.991 |
| 0.7659722222222222 | 88.991 |
| 0.7666666666666666 | 87.583 |
| 0.7673611111111112 | 86.175 |
| 0.7680555555555556 | 86.175 |
| 0.7687499999999999 | 84.766 |
| 0.7694444444444444 | 84.766 |
| 0.7701388888888889 | 84.766 |
| 0.7708333333333334 | 84.766 |
| 0.7715277777777777 | 86.175 |
| 0.7722222222222223 | 86.175 |
| 0.7729166666666667 | 86.175 |
| 0.7736111111111111 | 87.583 |
| 0.7743055555555555 | 88.991 |
| 0.775 | 90.399 |
| 0.7756944444444445 | 90.399 |
| 0.7763888888888889 | 90.399 |
| 0.7770833333333332 | 90.399 |
| 0.7777777777777778 | 88.991 |
| 0.7784722222222222 | 88.991 |
| 0.7791666666666667 | 86.175 |
| 0.779861111111111 | 84.766 |
| 0.7805555555555556 | 83.356 |
| 0.78125 | 81.946 |
| 0.7819444444444444 | 81.946 |
| 0.782638888888889 | 80.536 |
| 0.7833333333333333 | 79.125 |
| 0.7840277777777778 | 79.125 |
| 0.7847222222222222 | 77.715 |
| 0.7854166666666668 | 76.304 |
| 0.7861111111111111 | 76.304 |
| 0.7868055555555555 | 74.892 |
| 0.7875 | 73.481 |
| 0.7881944444444445 | 72.069 |
| 0.7888888888888889 | 70.658 |
| 0.7895833333333333 | 69.246 |
| 0.7902777777777777 | 67.835 |
| 0.7909722222222223 | 67.835 |
| 0.7916666666666666 | 65.012 |
| 0.7923611111111111 | 62.189 |
| 0.7930555555555556 | 57.958 |
| 0.7937500000000001 | 53.73 |
| 0.7944444444444444 | 49.507 |
| 0.7951388888888888 | 45.29 |
| 0.7958333333333334 | 42.483 |
| 0.7965277777777778 | 38.28 |
| 0.7972222222222222 | 35.483 |
| 0.7979166666666666 | 32.691 |
| 0.7986111111111112 | 31.297 |
| 0.7993055555555556 | 28.514 |
| 0.7999999999999999 | 27.124 |
| 0.8006944444444444 | 24.35 |
| 0.8013888888888889 | 22.965 |
| 0.8020833333333334 | 20.201 |
| 0.8027777777777777 | 17.444 |
| 0.8034722222222223 | 16.069 |
| 0.8041666666666667 | 14.696 |
| 0.8048611111111111 | 13.325 |
| 0.8055555555555555 | 11.956 |
| 0.80625 | 10.589 |
| 0.8069444444444445 | 10.589 |
| 0.8076388888888889 | 10.589 |
| 0.8083333333333332 | 9.225 |
| 0.8090277777777778 | 9.225 |
| 0.8097222222222222 | 7.862 |
| 0.8104166666666667 | 7.862 |
| 0.811111111111111 | 6.503 |
| 0.8118055555555556 | 5.146 |
| 0.8125 | 5.146 |
| 0.8131944444444444 | 3.791 |
| 0.813888888888889 | 3.791 |
| 0.8145833333333333 | 3.791 |
| 0.8152777777777778 | 3.791 |
| 0.8159722222222222 | 2.439 |
| 0.8166666666666668 | 2.439 |
| 0.8173611111111111 | 2.439 |
| 0.8180555555555555 | 1.09 |
| 0.81875 | 1.09 |
| 0.8194444444444445 | 1.09 |
| 0.8201388888888889 | 1.09 |
| 0.8208333333333333 | 1.09 |
| 0.8215277777777777 | 1.09 |
| 0.8222222222222223 | 1.09 |
| 0.8229166666666666 | -0.256 |
| 0.8236111111111111 | -0.256 |
| 0.8243055555555556 | -0.256 |
| 0.8250000000000001 | -0.256 |
| 0.8256944444444444 | -0.256 |
| 0.8263888888888888 | -0.256 |
| 0.8270833333333334 | -0.256 |
| 0.8277777777777778 | -0.256 |
| 0.8284722222222222 | -0.256 |
| 0.8291666666666666 | -0.256 |
| 0.8298611111111112 | -0.256 |
| 0.8305555555555556 | -0.256 |
| 0.8312499999999999 | -0.256 |
| 0.8319444444444444 | -0.256 |
| 0.8326388888888889 | -0.256 |
| 0.8333333333333334 | -0.256 |
| 0.8340277777777777 | -0.256 |
| 0.8347222222222223 | -0.256 |
| 0.8354166666666667 | -0.256 |
| 0.8361111111111111 | -0.256 |
| 0.8368055555555555 | -0.256 |
| 0.8375 | -0.256 |
| 0.8381944444444445 | -0.256 |
| 0.8388888888888889 | -0.256 |
| 0.8395833333333332 | -0.256 |
| 0.8402777777777778 | -0.256 |
| 0.8409722222222222 | -0.256 |
| 0.8416666666666667 | -0.256 |
| 0.842361111111111 | -0.256 |
| 0.8430555555555556 | -0.256 |
| 0.84375 | -0.256 |
| 0.8444444444444444 | -0.256 |
| 0.845138888888889 | -0.256 |
| 0.8458333333333333 | -0.256 |
| 0.8465277777777778 | -0.256 |
| 0.8472222222222222 | -0.256 |
| 0.8479166666666668 | -0.256 |
| 0.8486111111111111 | -0.256 |
| 0.8493055555555555 | -0.256 |
| 0.85 | -0.256 |
| 0.8506944444444445 | -0.256 |
| 0.8513888888888889 | -0.256 |
| 0.8520833333333333 | -0.256 |
| 0.8527777777777777 | -0.256 |
| 0.8534722222222223 | -0.256 |
| 0.8541666666666666 | -0.256 |
| 0.8548611111111111 | -0.256 |
| 0.8555555555555556 | -0.256 |
| 0.8562500000000001 | -0.256 |
| 0.8569444444444444 | -0.256 |
| 0.8576388888888888 | -0.256 |
| 0.8583333333333334 | -0.256 |
| 0.8590277777777778 | -0.256 |
| 0.8597222222222222 | -0.256 |
| 0.8604166666666666 | -0.256 |
| 0.8611111111111112 | -0.256 |
| 0.8618055555555556 | -0.256 |
| 0.8624999999999999 | -0.256 |
| 0.8631944444444444 | -0.256 |
| 0.8638888888888889 | -0.256 |
| 0.8645833333333334 | -0.256 |
| 0.8652777777777777 | -0.256 |
| 0.8659722222222223 | -0.256 |
| 0.8666666666666667 | -0.256 |
| 0.8673611111111111 | -0.256 |
| 0.8680555555555555 | -0.256 |
| 0.86875 | -0.256 |
| 0.8694444444444445 | -0.256 |
| 0.8701388888888889 | -0.256 |
| 0.8708333333333332 | -0.256 |
| 0.8715277777777778 | -0.256 |
| 0.8722222222222222 | -0.256 |
| 0.8729166666666667 | -0.256 |
| 0.873611111111111 | -0.256 |
| 0.8743055555555556 | -0.256 |
| 0.875 | -0.256 |
| 0.8756944444444444 | -0.256 |
| 0.876388888888889 | -0.256 |
| 0.8770833333333333 | -0.256 |
| 0.8777777777777778 | -0.256 |
| 0.8784722222222222 | -0.256 |
| 0.8791666666666668 | -0.256 |
| 0.8798611111111111 | -0.256 |
| 0.8805555555555555 | -0.256 |
| 0.88125 | -0.256 |
| 0.8819444444444445 | -0.256 |
| 0.8826388888888889 | -0.256 |
| 0.8833333333333333 | -0.256 |
| 0.8840277777777777 | -0.256 |
| 0.8847222222222223 | -0.256 |
| 0.8854166666666666 | -0.256 |
| 0.8861111111111111 | -0.256 |
| 0.8868055555555556 | -0.256 |
| 0.8875000000000001 | -0.256 |
| 0.8881944444444444 | -0.256 |
| 0.8888888888888888 | -0.256 |
| 0.8895833333333334 | -0.256 |
| 0.8902777777777778 | -0.256 |
| 0.8909722222222222 | -0.256 |
| 0.8916666666666666 | -0.256 |
| 0.8923611111111112 | -0.256 |
| 0.8930555555555556 | -0.256 |
| 0.8937499999999999 | -0.256 |
| 0.8944444444444444 | -0.256 |
| 0.8951388888888889 | -0.256 |
| 0.8958333333333334 | -0.256 |
| 0.8965277777777777 | -0.256 |
| 0.8972222222222223 | -0.256 |
| 0.8979166666666667 | -0.256 |
| 0.8986111111111111 | -0.256 |
| 0.8993055555555555 | -0.256 |
| 0.9 | -0.256 |
| 0.9006944444444445 | -0.256 |
| 0.9013888888888889 | -0.256 |
| 0.9020833333333332 | -0.256 |
| 0.9027777777777778 | -0.256 |
| 0.9034722222222222 | -0.256 |
| 0.9041666666666667 | -0.256 |
| 0.904861111111111 | -0.256 |
| 0.9055555555555556 | -0.256 |
| 0.90625 | -0.256 |
| 0.9069444444444444 | -0.256 |
| 0.907638888888889 | -0.256 |
| 0.9083333333333333 | -0.256 |
| 0.9090277777777778 | -0.256 |
| 0.9097222222222222 | -0.256 |
| 0.9104166666666668 | -0.256 |
| 0.9111111111111111 | -0.256 |
| 0.9118055555555555 | -0.256 |
| 0.9125 | -0.256 |
| 0.9131944444444445 | -0.256 |
| 0.9138888888888889 | -0.256 |
| 0.9145833333333333 | -0.256 |
| 0.9152777777777777 | -0.256 |
| 0.9159722222222223 | -0.256 |
| 0.9166666666666666 | -0.256 |
| 0.9173611111111111 | -0.256 |
| 0.9180555555555556 | -0.256 |
| 0.9187500000000001 | -0.256 |
| 0.9194444444444444 | -0.256 |
| 0.9201388888888888 | -0.256 |
| 0.9208333333333334 | -0.256 |
| 0.9215277777777778 | -0.256 |
| 0.9222222222222222 | -0.256 |
| 0.9229166666666666 | -0.256 |
| 0.9236111111111112 | -0.256 |
| 0.9243055555555556 | -0.256 |
| 0.9249999999999999 | -0.256 |
| 0.9256944444444444 | -0.256 |
| 0.9263888888888889 | -0.256 |
| 0.9270833333333334 | -0.256 |
| 0.9277777777777777 | -0.256 |
| 0.9284722222222223 | -0.256 |
| 0.9291666666666667 | -0.256 |
| 0.9298611111111111 | -0.256 |
| 0.9305555555555555 | -0.256 |
| 0.93125 | -0.256 |
| 0.9319444444444445 | -0.256 |
| 0.9326388888888889 | -0.256 |
| 0.9333333333333332 | -0.256 |
| 0.9340277777777778 | -0.256 |
| 0.9347222222222222 | -0.256 |
| 0.9354166666666667 | -0.256 |
| 0.936111111111111 | -0.256 |
| 0.9368055555555556 | -0.256 |
| 0.9375 | -0.256 |
| 0.9381944444444444 | -0.256 |
| 0.938888888888889 | -0.256 |
| 0.9395833333333333 | -0.256 |
| 0.9402777777777778 | -0.256 |
| 0.9409722222222222 | -0.256 |
| 0.9416666666666668 | -0.256 |
| 0.9423611111111111 | -0.256 |
| 0.9430555555555555 | -0.256 |
| 0.94375 | -0.256 |
| 0.9444444444444445 | -0.256 |
| 0.9451388888888889 | -0.256 |
| 0.9458333333333333 | -0.256 |
| 0.9465277777777777 | -0.256 |
| 0.9472222222222223 | -0.256 |
| 0.9479166666666666 | -0.256 |
| 0.9486111111111111 | -0.256 |
| 0.9493055555555556 | -0.256 |
| 0.9500000000000001 | -0.256 |
| 0.9506944444444444 | -0.256 |
| 0.9513888888888888 | -0.256 |
| 0.9520833333333334 | -0.256 |
| 0.9527777777777778 | -0.256 |
| 0.9534722222222222 | -0.256 |
| 0.9541666666666666 | -0.256 |
| 0.9548611111111112 | -0.256 |
| 0.9555555555555556 | -0.256 |
| 0.9562499999999999 | -0.256 |
| 0.9569444444444444 | -0.256 |
| 0.9576388888888889 | -0.256 |
| 0.9583333333333334 | -0.256 |
| 0.9590277777777777 | -0.256 |
| 0.9597222222222223 | -0.256 |
| 0.9604166666666667 | -0.256 |
| 0.9611111111111111 | -0.256 |
| 0.9618055555555555 | -0.256 |
| 0.9625 | -0.256 |
| 0.9631944444444445 | -0.256 |
| 0.9638888888888889 | -0.256 |
| 0.9645833333333332 | -0.256 |
| 0.9652777777777778 | -0.256 |
| 0.9659722222222222 | -0.256 |
| 0.9666666666666667 | -0.256 |
| 0.967361111111111 | -0.256 |
| 0.9680555555555556 | -0.256 |
| 0.96875 | -0.256 |
| 0.9694444444444444 | -0.256 |
| 0.970138888888889 | -0.256 |
| 0.9708333333333333 | -0.256 |
| 0.9715277777777778 | -0.256 |
| 0.9722222222222222 | -0.256 |
| 0.9729166666666668 | -0.256 |
| 0.9736111111111111 | -0.256 |
| 0.9743055555555555 | -0.256 |
| 0.975 | -0.256 |
| 0.9756944444444445 | -0.256 |
| 0.9763888888888889 | -0.256 |
| 0.9770833333333333 | -0.256 |
| 0.9777777777777777 | -0.256 |
| 0.9784722222222223 | -0.256 |
| 0.9791666666666666 | -0.256 |
| 0.9798611111111111 | -0.256 |
| 0.9805555555555556 | -0.256 |
| 0.9812500000000001 | -0.256 |
| 0.9819444444444444 | -0.256 |
| 0.9826388888888888 | -0.256 |
| 0.9833333333333334 | -0.256 |
| 0.9840277777777778 | -0.256 |
| 0.9847222222222222 | -0.256 |
| 0.9854166666666666 | -0.256 |
| 0.9861111111111112 | -0.256 |
| 0.9868055555555556 | -0.256 |
| 0.9874999999999999 | -0.256 |
| 0.9881944444444444 | -0.256 |
| 0.9888888888888889 | -0.256 |
| 0.9895833333333334 | -0.256 |
| 0.9902777777777777 | -0.256 |
| 0.9909722222222223 | -0.256 |
| 0.9916666666666667 | -0.256 |
| 0.9923611111111111 | -0.256 |
| 0.9930555555555555 | -0.256 |
| 0.99375 | -0.256 |
| 0.9944444444444445 | -0.256 |
| 0.9951388888888889 | -0.256 |
| 0.9958333333333332 | -0.256 |
| 0.9965277777777778 | -0.256 |
| 0.9972222222222222 | -0.256 |
| 0.9979166666666667 | -0.256 |
| 0.998611111111111 | -0.256 |
| 0.9993055555555556 | 0 |